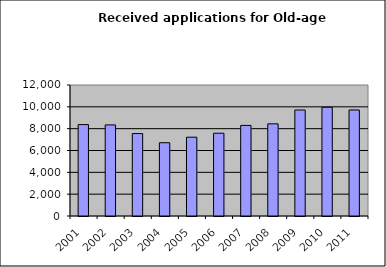
| Category | Series 1 |
|---|---|
| 2001.0 | 8373 |
| 2002.0 | 8343 |
| 2003.0 | 7552 |
| 2004.0 | 6712 |
| 2005.0 | 7219 |
| 2006.0 | 7583 |
| 2007.0 | 8298 |
| 2008.0 | 8442 |
| 2009.0 | 9709 |
| 2010.0 | 9961 |
| 2011.0 | 9712 |